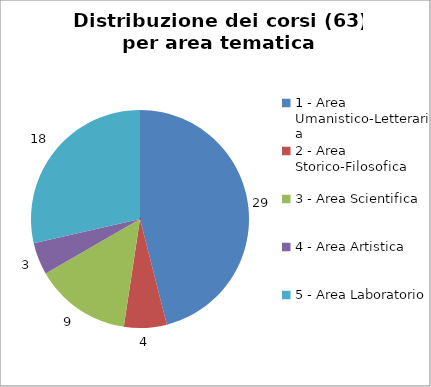
| Category | Nr. Corsi |
|---|---|
| 1 - Area Umanistico-Letteraria | 29 |
| 2 - Area Storico-Filosofica | 4 |
| 3 - Area Scientifica | 9 |
| 4 - Area Artistica | 3 |
| 5 - Area Laboratorio | 18 |